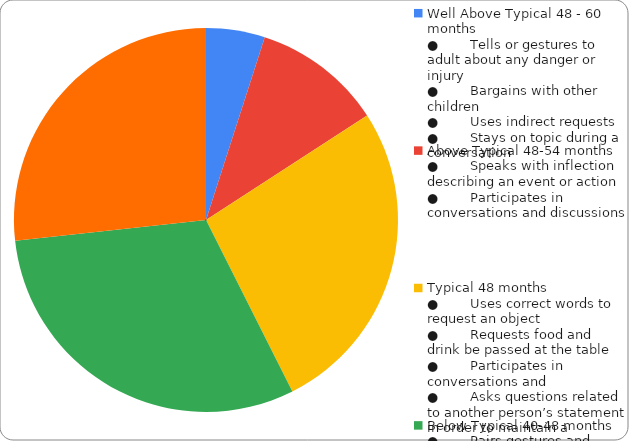
| Category | Series 0 |
|---|---|
| Well Above Typical 48 - 60 months
●        Tells or gestures to adult about any danger or injury
●        Bargains with other children
●        Uses indirect requests
●        Stays on topic during a conversation
 | 0.049 |
| Above Typical 48-54 months
●        Speaks with inflection describing an event or action
●        Participates in conversations and discussions
 | 0.107 |
| Typical 48 months
●        Uses correct words to request an object
●        Requests food and drink be passed at the table
●        Participates in conversations and 
●        Asks questions related to another person’s statement in order to maintain a conv | 0.262 |
| Below Typical 40-48 months
●        Pairs gestures and speech similar to adult level
●        Carries on a conversation
●        Makes conversation repairs when the listener has not understood
●        Requests permission
 | 0.301 |
| Well Below Typical 36-42 months or below
●        Asks “is?” or “do?”
●        Changes speech depending on the listener
●        Talks on the phone and waits for turn to respond
●        Responds to and makes verbal greetings
●        Asks who questions.
● | 0.262 |